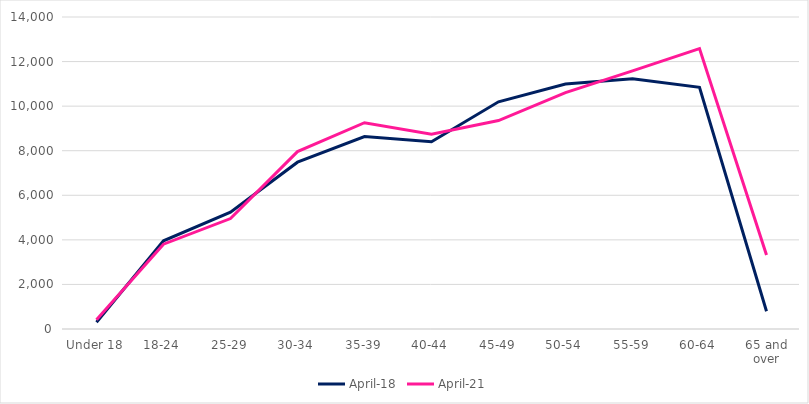
| Category | April-18 | April-21 |
|---|---|---|
| Under 18 | 300 | 420 |
| 18-24 | 3960 | 3805 |
| 25-29 | 5245 | 4955 |
| 30-34 | 7485 | 7960 |
| 35-39 | 8635 | 9255 |
| 40-44 | 8400 | 8745 |
| 45-49 | 10195 | 9355 |
| 50-54 | 10995 | 10605 |
| 55-59 | 11230 | 11580 |
| 60-64 | 10845 | 12580 |
| 65 and over | 795 | 3320 |